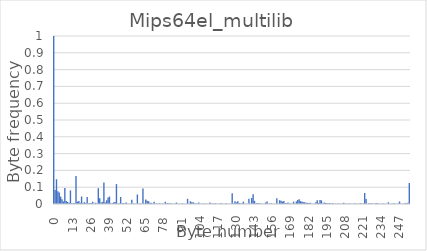
| Category | Series 0 |
|---|---|
| 0.0 | 1 |
| 1.0 | 0.084 |
| 2.0 | 0.147 |
| 3.0 | 0.075 |
| 4.0 | 0.069 |
| 5.0 | 0.044 |
| 6.0 | 0.028 |
| 7.0 | 0.015 |
| 8.0 | 0.095 |
| 9.0 | 0.018 |
| 10.0 | 0.012 |
| 11.0 | 0.007 |
| 12.0 | 0.081 |
| 13.0 | 0.004 |
| 14.0 | 0.004 |
| 15.0 | 0.005 |
| 16.0 | 0.167 |
| 17.0 | 0.014 |
| 18.0 | 0.018 |
| 19.0 | 0.007 |
| 20.0 | 0.045 |
| 21.0 | 0.005 |
| 22.0 | 0.011 |
| 23.0 | 0.006 |
| 24.0 | 0.042 |
| 25.0 | 0.004 |
| 26.0 | 0.005 |
| 27.0 | 0.005 |
| 28.0 | 0.013 |
| 29.0 | 0.002 |
| 30.0 | 0.007 |
| 31.0 | 0.003 |
| 32.0 | 0.094 |
| 33.0 | 0.034 |
| 34.0 | 0.009 |
| 35.0 | 0.013 |
| 36.0 | 0.128 |
| 37.0 | 0.009 |
| 38.0 | 0.022 |
| 39.0 | 0.039 |
| 40.0 | 0.044 |
| 41.0 | 0.003 |
| 42.0 | 0.005 |
| 43.0 | 0.01 |
| 44.0 | 0.012 |
| 45.0 | 0.119 |
| 46.0 | 0.003 |
| 47.0 | 0.003 |
| 48.0 | 0.042 |
| 49.0 | 0.004 |
| 50.0 | 0.005 |
| 51.0 | 0.003 |
| 52.0 | 0.009 |
| 53.0 | 0.001 |
| 54.0 | 0.002 |
| 55.0 | 0.001 |
| 56.0 | 0.025 |
| 57.0 | 0.003 |
| 58.0 | 0.002 |
| 59.0 | 0.002 |
| 60.0 | 0.057 |
| 61.0 | 0.001 |
| 62.0 | 0.002 |
| 63.0 | 0.002 |
| 64.0 | 0.092 |
| 65.0 | 0.002 |
| 66.0 | 0.026 |
| 67.0 | 0.019 |
| 68.0 | 0.017 |
| 69.0 | 0.008 |
| 70.0 | 0.007 |
| 71.0 | 0.004 |
| 72.0 | 0.014 |
| 73.0 | 0.002 |
| 74.0 | 0.002 |
| 75.0 | 0.002 |
| 76.0 | 0.005 |
| 77.0 | 0.001 |
| 78.0 | 0.002 |
| 79.0 | 0.001 |
| 80.0 | 0.014 |
| 81.0 | 0.004 |
| 82.0 | 0.005 |
| 83.0 | 0.002 |
| 84.0 | 0.005 |
| 85.0 | 0.002 |
| 86.0 | 0.002 |
| 87.0 | 0.002 |
| 88.0 | 0.009 |
| 89.0 | 0.002 |
| 90.0 | 0.001 |
| 91.0 | 0.001 |
| 92.0 | 0.004 |
| 93.0 | 0.001 |
| 94.0 | 0.002 |
| 95.0 | 0.001 |
| 96.0 | 0.031 |
| 97.0 | 0.001 |
| 98.0 | 0.016 |
| 99.0 | 0.01 |
| 100.0 | 0.01 |
| 101.0 | 0.004 |
| 102.0 | 0.003 |
| 103.0 | 0.002 |
| 104.0 | 0.008 |
| 105.0 | 0.001 |
| 106.0 | 0.002 |
| 107.0 | 0.001 |
| 108.0 | 0.003 |
| 109.0 | 0.001 |
| 110.0 | 0.001 |
| 111.0 | 0.001 |
| 112.0 | 0.009 |
| 113.0 | 0.002 |
| 114.0 | 0.002 |
| 115.0 | 0.003 |
| 116.0 | 0.004 |
| 117.0 | 0.001 |
| 118.0 | 0.002 |
| 119.0 | 0.001 |
| 120.0 | 0.006 |
| 121.0 | 0.001 |
| 122.0 | 0.001 |
| 123.0 | 0.001 |
| 124.0 | 0.005 |
| 125.0 | 0.001 |
| 126.0 | 0.001 |
| 127.0 | 0.001 |
| 128.0 | 0.064 |
| 129.0 | 0.003 |
| 130.0 | 0.017 |
| 131.0 | 0.009 |
| 132.0 | 0.016 |
| 133.0 | 0.005 |
| 134.0 | 0.003 |
| 135.0 | 0.004 |
| 136.0 | 0.014 |
| 137.0 | 0.002 |
| 138.0 | 0.002 |
| 139.0 | 0.001 |
| 140.0 | 0.032 |
| 141.0 | 0.002 |
| 142.0 | 0.035 |
| 143.0 | 0.058 |
| 144.0 | 0.018 |
| 145.0 | 0.003 |
| 146.0 | 0.006 |
| 147.0 | 0.004 |
| 148.0 | 0.005 |
| 149.0 | 0.001 |
| 150.0 | 0.002 |
| 151.0 | 0.002 |
| 152.0 | 0.009 |
| 153.0 | 0.015 |
| 154.0 | 0.002 |
| 155.0 | 0.001 |
| 156.0 | 0.004 |
| 157.0 | 0.001 |
| 158.0 | 0.001 |
| 159.0 | 0.001 |
| 160.0 | 0.034 |
| 161.0 | 0.001 |
| 162.0 | 0.022 |
| 163.0 | 0.019 |
| 164.0 | 0.014 |
| 165.0 | 0.018 |
| 166.0 | 0.007 |
| 167.0 | 0.005 |
| 168.0 | 0.009 |
| 169.0 | 0.003 |
| 170.0 | 0.003 |
| 171.0 | 0.002 |
| 172.0 | 0.014 |
| 173.0 | 0.002 |
| 174.0 | 0.015 |
| 175.0 | 0.024 |
| 176.0 | 0.028 |
| 177.0 | 0.017 |
| 178.0 | 0.014 |
| 179.0 | 0.011 |
| 180.0 | 0.011 |
| 181.0 | 0.008 |
| 182.0 | 0.007 |
| 183.0 | 0.005 |
| 184.0 | 0.007 |
| 185.0 | 0.001 |
| 186.0 | 0.001 |
| 187.0 | 0.001 |
| 188.0 | 0.01 |
| 189.0 | 0.022 |
| 190.0 | 0.006 |
| 191.0 | 0.024 |
| 192.0 | 0.021 |
| 193.0 | 0.002 |
| 194.0 | 0.009 |
| 195.0 | 0.006 |
| 196.0 | 0.006 |
| 197.0 | 0.003 |
| 198.0 | 0.006 |
| 199.0 | 0.002 |
| 200.0 | 0.006 |
| 201.0 | 0.001 |
| 202.0 | 0.002 |
| 203.0 | 0.001 |
| 204.0 | 0.003 |
| 205.0 | 0.001 |
| 206.0 | 0.001 |
| 207.0 | 0.001 |
| 208.0 | 0.007 |
| 209.0 | 0.001 |
| 210.0 | 0.002 |
| 211.0 | 0.001 |
| 212.0 | 0.003 |
| 213.0 | 0.001 |
| 214.0 | 0.002 |
| 215.0 | 0.001 |
| 216.0 | 0.004 |
| 217.0 | 0.001 |
| 218.0 | 0.001 |
| 219.0 | 0.001 |
| 220.0 | 0.005 |
| 221.0 | 0.001 |
| 222.0 | 0.003 |
| 223.0 | 0.066 |
| 224.0 | 0.03 |
| 225.0 | 0.001 |
| 226.0 | 0.004 |
| 227.0 | 0.002 |
| 228.0 | 0.004 |
| 229.0 | 0.002 |
| 230.0 | 0.002 |
| 231.0 | 0.005 |
| 232.0 | 0.006 |
| 233.0 | 0.001 |
| 234.0 | 0.001 |
| 235.0 | 0.001 |
| 236.0 | 0.004 |
| 237.0 | 0.001 |
| 238.0 | 0.001 |
| 239.0 | 0.002 |
| 240.0 | 0.01 |
| 241.0 | 0.001 |
| 242.0 | 0.002 |
| 243.0 | 0.002 |
| 244.0 | 0.005 |
| 245.0 | 0.002 |
| 246.0 | 0.002 |
| 247.0 | 0.003 |
| 248.0 | 0.015 |
| 249.0 | 0.002 |
| 250.0 | 0.002 |
| 251.0 | 0.002 |
| 252.0 | 0.006 |
| 253.0 | 0.003 |
| 254.0 | 0.007 |
| 255.0 | 0.125 |